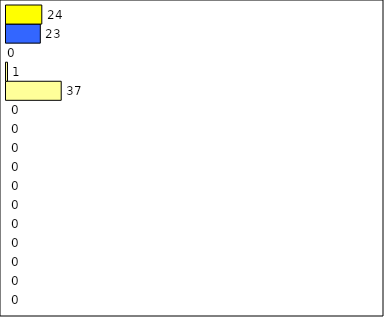
| Category | -2 | -1 | 0 | 1 | 2 | 3 | 4 | 5 | 6 | 7 | 8 | 9 | 10 | 11 | 12 | Perfect Round |
|---|---|---|---|---|---|---|---|---|---|---|---|---|---|---|---|---|
| 0 | 0 | 0 | 0 | 0 | 0 | 0 | 0 | 0 | 0 | 0 | 0 | 37 | 1 | 0 | 23 | 24 |